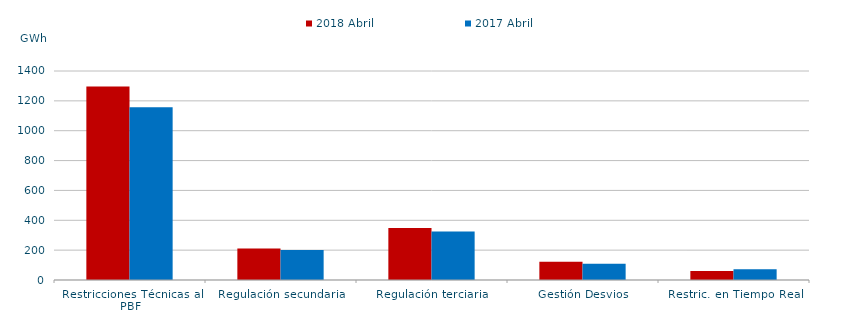
| Category | 2018 | 2017 |
|---|---|---|
| Restricciones Técnicas al PBF | 1296.816 | 1157.028 |
| Regulación secundaria | 210.676 | 200.165 |
| Regulación terciaria | 347.866 | 324.875 |
| Gestión Desvios | 122.622 | 108.491 |
| Restric. en Tiempo Real | 60.774 | 72.472 |